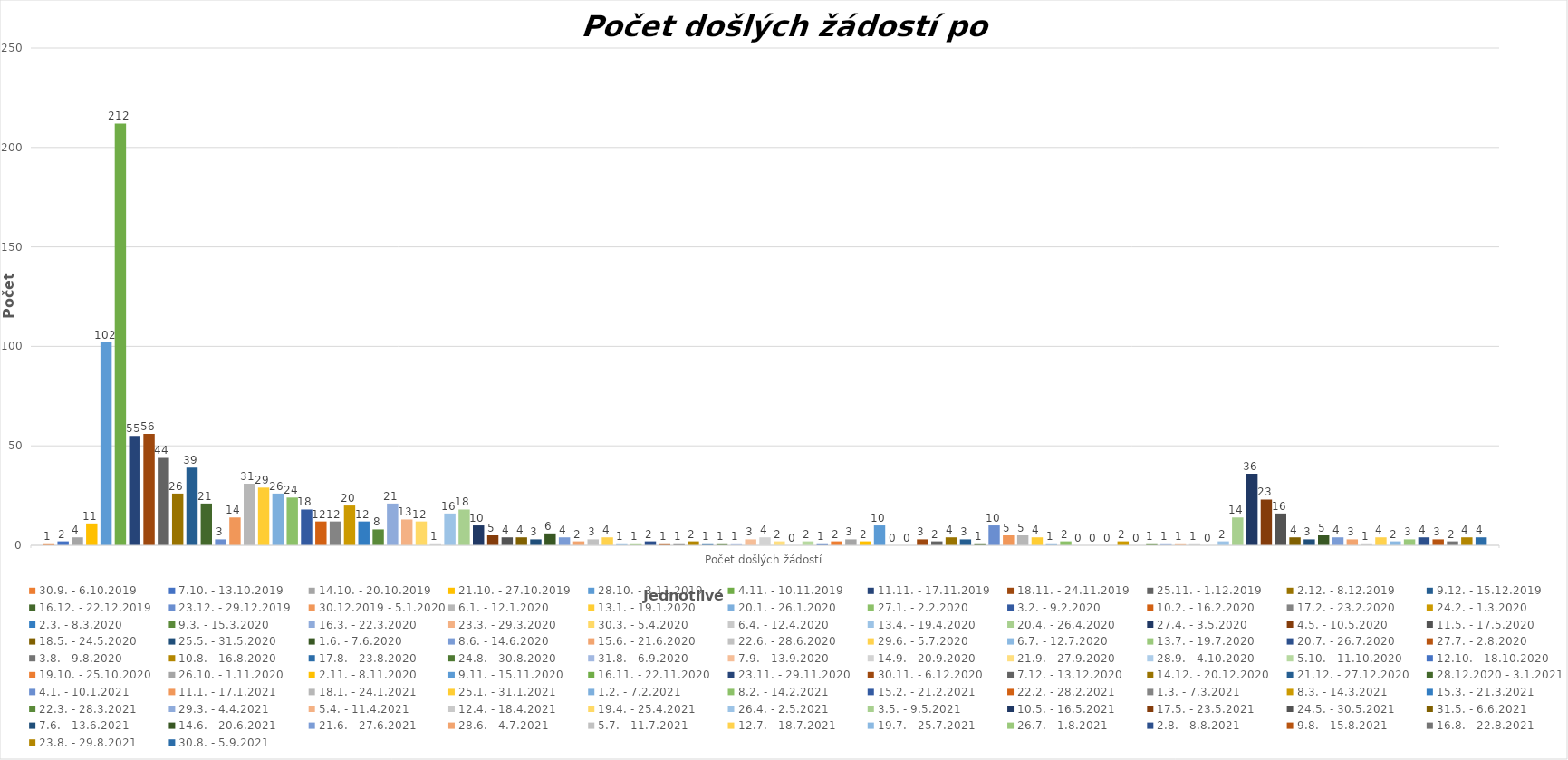
| Category | 30.9. - 6.10.2019 | 7.10. - 13.10.2019 | 14.10. - 20.10.2019 | 21.10. - 27.10.2019 | 28.10. - 3.11.2019 | 4.11. - 10.11.2019 | 11.11. - 17.11.2019 | 18.11. - 24.11.2019 | 25.11. - 1.12.2019 | 2.12. - 8.12.2019 | 9.12. - 15.12.2019 | 16.12. - 22.12.2019 | 23.12. - 29.12.2019 | 30.12.2019 - 5.1.2020 | 6.1. - 12.1.2020 | 13.1. - 19.1.2020 | 20.1. - 26.1.2020 | 27.1. - 2.2.2020 | 3.2. - 9.2.2020 | 10.2. - 16.2.2020 | 17.2. - 23.2.2020 | 24.2. - 1.3.2020 | 2.3. - 8.3.2020 | 9.3. - 15.3.2020 | 16.3. - 22.3.2020 | 23.3. - 29.3.2020 | 30.3. - 5.4.2020 | 6.4. - 12.4.2020 | 13.4. - 19.4.2020 | 20.4. - 26.4.2020 | 27.4. - 3.5.2020 | 4.5. - 10.5.2020 | 11.5. - 17.5.2020 | 18.5. - 24.5.2020 | 25.5. - 31.5.2020 | 1.6. - 7.6.2020 | 8.6. - 14.6.2020 | 15.6. - 21.6.2020 | 22.6. - 28.6.2020 | 29.6. - 5.7.2020 | 6.7. - 12.7.2020 | 13.7. - 19.7.2020 | 20.7. - 26.7.2020 | 27.7. - 2.8.2020 | 3.8. - 9.8.2020 | 10.8. - 16.8.2020 | 17.8. - 23.8.2020 | 24.8. - 30.8.2020 | 31.8. - 6.9.2020 | 7.9. - 13.9.2020 | 14.9. - 20.9.2020 | 21.9. - 27.9.2020 | 28.9. - 4.10.2020 | 5.10. - 11.10.2020 | 12.10. - 18.10.2020 | 19.10. - 25.10.2020 | 26.10. - 1.11.2020 | 2.11. - 8.11.2020 | 9.11. - 15.11.2020 | 16.11. - 22.11.2020 | 23.11. - 29.11.2020 | 30.11. - 6.12.2020 | 7.12. - 13.12.2020 | 14.12. - 20.12.2020 | 21.12. - 27.12.2020 | 28.12.2020 - 3.1.2021 | 4.1. - 10.1.2021 | 11.1. - 17.1.2021 | 18.1. - 24.1.2021 | 25.1. - 31.1.2021 | 1.2. - 7.2.2021 | 8.2. - 14.2.2021 | 15.2. - 21.2.2021 | 22.2. - 28.2.2021 | 1.3. - 7.3.2021 | 8.3. - 14.3.2021 | 15.3. - 21.3.2021 | 22.3. - 28.3.2021 | 29.3. - 4.4.2021 | 5.4. - 11.4.2021 | 12.4. - 18.4.2021 | 19.4. - 25.4.2021 | 26.4. - 2.5.2021 | 3.5. - 9.5.2021 | 10.5. - 16.5.2021 | 17.5. - 23.5.2021 | 24.5. - 30.5.2021 | 31.5. - 6.6.2021 | 7.6. - 13.6.2021 | 14.6. - 20.6.2021 | 21.6. - 27.6.2021 | 28.6. - 4.7.2021 | 5.7. - 11.7.2021 | 12.7. - 18.7.2021 | 19.7. - 25.7.2021 | 26.7. - 1.8.2021 | 2.8. - 8.8.2021 | 9.8. - 15.8.2021 | 16.8. - 22.8.2021 | 23.8. - 29.8.2021 | 30.8. - 5.9.2021 |
|---|---|---|---|---|---|---|---|---|---|---|---|---|---|---|---|---|---|---|---|---|---|---|---|---|---|---|---|---|---|---|---|---|---|---|---|---|---|---|---|---|---|---|---|---|---|---|---|---|---|---|---|---|---|---|---|---|---|---|---|---|---|---|---|---|---|---|---|---|---|---|---|---|---|---|---|---|---|---|---|---|---|---|---|---|---|---|---|---|---|---|---|---|---|---|---|---|---|---|---|---|---|
| Počet došlých žádostí | 1 | 2 | 4 | 11 | 102 | 212 | 55 | 56 | 44 | 26 | 39 | 21 | 3 | 14 | 31 | 29 | 26 | 24 | 18 | 12 | 12 | 20 | 12 | 8 | 21 | 13 | 12 | 1 | 16 | 18 | 10 | 5 | 4 | 4 | 3 | 6 | 4 | 2 | 3 | 4 | 1 | 1 | 2 | 1 | 1 | 2 | 1 | 1 | 1 | 3 | 4 | 2 | 0 | 2 | 1 | 2 | 3 | 2 | 10 | 0 | 0 | 3 | 2 | 4 | 3 | 1 | 10 | 5 | 5 | 4 | 1 | 2 | 0 | 0 | 0 | 2 | 0 | 1 | 1 | 1 | 1 | 0 | 2 | 14 | 36 | 23 | 16 | 4 | 3 | 5 | 4 | 3 | 1 | 4 | 2 | 3 | 4 | 3 | 2 | 4 | 4 |